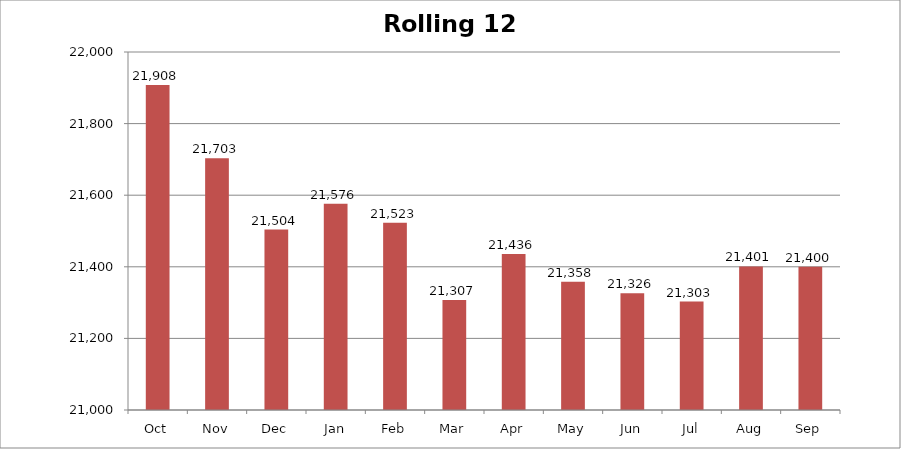
| Category | Rolling 12 Month |
|---|---|
| Oct | 21908 |
| Nov | 21703 |
| Dec | 21504 |
| Jan | 21576 |
| Feb | 21523 |
| Mar | 21307 |
| Apr | 21436 |
| May | 21358 |
| Jun | 21326 |
| Jul | 21303 |
| Aug | 21401 |
| Sep | 21400 |